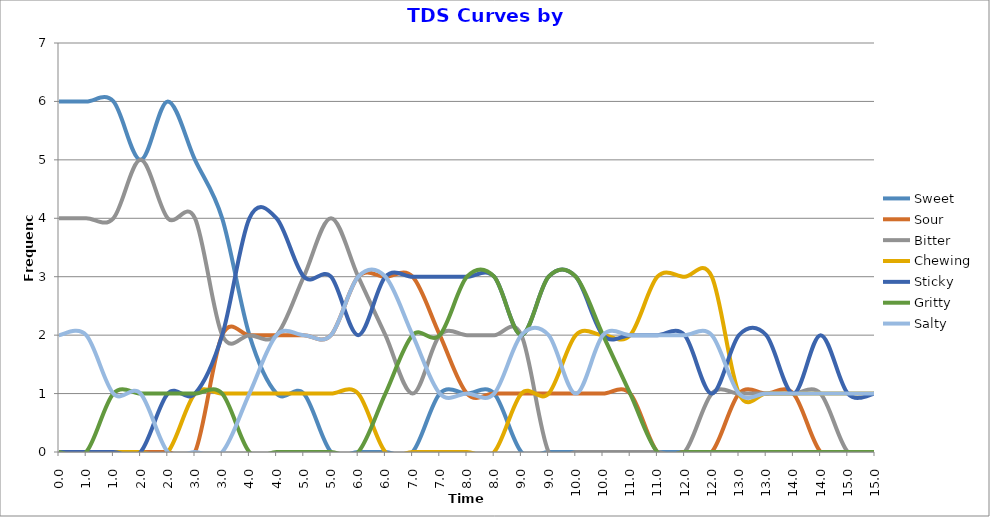
| Category | Sweet | Sour | Bitter | Chewing | Sticky | Gritty | Salty |
|---|---|---|---|---|---|---|---|
| 0.0 | 6 | 0 | 4 | 0 | 0 | 0 | 2 |
| 1.0 | 6 | 0 | 4 | 0 | 0 | 0 | 2 |
| 1.0 | 6 | 0 | 4 | 0 | 0 | 1 | 1 |
| 2.0 | 5 | 0 | 5 | 0 | 0 | 1 | 1 |
| 2.0 | 6 | 0 | 4 | 0 | 1 | 1 | 0 |
| 3.0 | 5 | 0 | 4 | 1 | 1 | 1 | 0 |
| 3.0 | 4 | 2 | 2 | 1 | 2 | 1 | 0 |
| 4.0 | 2 | 2 | 2 | 1 | 4 | 0 | 1 |
| 4.0 | 1 | 2 | 2 | 1 | 4 | 0 | 2 |
| 5.0 | 1 | 2 | 3 | 1 | 3 | 0 | 2 |
| 5.0 | 0 | 2 | 4 | 1 | 3 | 0 | 2 |
| 6.0 | 0 | 3 | 3 | 1 | 2 | 0 | 3 |
| 6.0 | 0 | 3 | 2 | 0 | 3 | 1 | 3 |
| 7.0 | 0 | 3 | 1 | 0 | 3 | 2 | 2 |
| 7.0 | 1 | 2 | 2 | 0 | 3 | 2 | 1 |
| 8.0 | 1 | 1 | 2 | 0 | 3 | 3 | 1 |
| 8.0 | 1 | 1 | 2 | 0 | 3 | 3 | 1 |
| 9.0 | 0 | 1 | 2 | 1 | 2 | 2 | 2 |
| 9.0 | 0 | 1 | 0 | 1 | 3 | 3 | 2 |
| 10.0 | 0 | 1 | 0 | 2 | 3 | 3 | 1 |
| 10.0 | 0 | 1 | 0 | 2 | 2 | 2 | 2 |
| 11.0 | 0 | 1 | 0 | 2 | 2 | 1 | 2 |
| 11.0 | 0 | 0 | 0 | 3 | 2 | 0 | 2 |
| 12.0 | 0 | 0 | 0 | 3 | 2 | 0 | 2 |
| 12.0 | 0 | 0 | 1 | 3 | 1 | 0 | 2 |
| 13.0 | 0 | 1 | 1 | 1 | 2 | 0 | 1 |
| 13.0 | 0 | 1 | 1 | 1 | 2 | 0 | 1 |
| 14.0 | 0 | 1 | 1 | 1 | 1 | 0 | 1 |
| 14.0 | 0 | 0 | 1 | 1 | 2 | 0 | 1 |
| 15.0 | 0 | 0 | 0 | 1 | 1 | 0 | 1 |
| 15.0 | 0 | 0 | 0 | 1 | 1 | 0 | 1 |